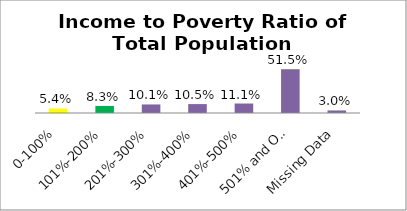
| Category | Percent |
|---|---|
| 0-100% | 0.054 |
| 101%-200% | 0.083 |
| 201%-300% | 0.101 |
| 301%-400% | 0.105 |
| 401%-500% | 0.111 |
| 501% and Over | 0.515 |
| Missing Data | 0.03 |